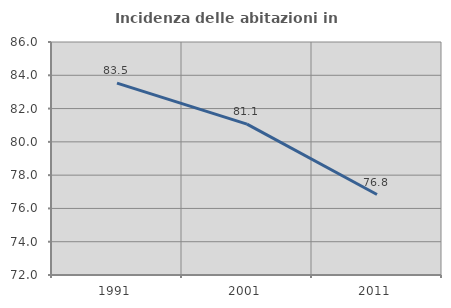
| Category | Incidenza delle abitazioni in proprietà  |
|---|---|
| 1991.0 | 83.525 |
| 2001.0 | 81.062 |
| 2011.0 | 76.836 |